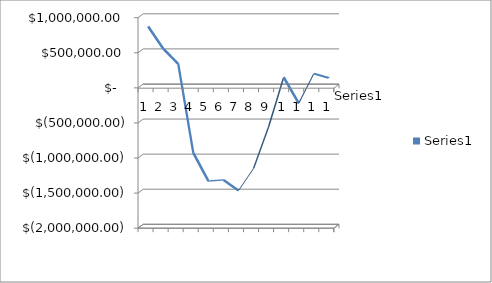
| Category | Series 0 |
|---|---|
| 0 | 835274.24 |
| 1 | 519046.17 |
| 2 | 299837.48 |
| 3 | -967776.86 |
| 4 | -1369070.08 |
| 5 | -1352963.53 |
| 6 | -1504901.84 |
| 7 | -1190009.2 |
| 8 | -596449.78 |
| 9 | 110939.8 |
| 10 | -260785.33 |
| 11 | 162213.18 |
| 12 | 100425.37 |